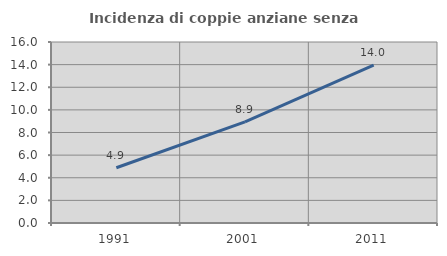
| Category | Incidenza di coppie anziane senza figli  |
|---|---|
| 1991.0 | 4.885 |
| 2001.0 | 8.937 |
| 2011.0 | 13.961 |